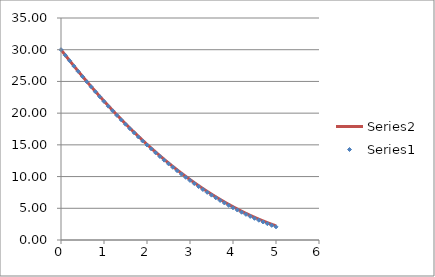
| Category | Series 1 |
|---|---|
| 0.0 | 30 |
| 0.1 | 29.133 |
| 0.2 | 28.279 |
| 0.30000000000000004 | 27.438 |
| 0.4 | 26.61 |
| 0.5 | 25.794 |
| 0.6 | 24.991 |
| 0.7 | 24.2 |
| 0.7999999999999999 | 23.423 |
| 0.8999999999999999 | 22.658 |
| 0.9999999999999999 | 21.906 |
| 1.0999999999999999 | 21.166 |
| 1.2 | 20.439 |
| 1.3 | 19.725 |
| 1.4000000000000001 | 19.023 |
| 1.5000000000000002 | 18.335 |
| 1.6000000000000003 | 17.658 |
| 1.7000000000000004 | 16.995 |
| 1.8000000000000005 | 16.344 |
| 1.9000000000000006 | 15.706 |
| 2.0000000000000004 | 15.081 |
| 2.1000000000000005 | 14.469 |
| 2.2000000000000006 | 13.869 |
| 2.3000000000000007 | 13.281 |
| 2.400000000000001 | 12.707 |
| 2.500000000000001 | 12.145 |
| 2.600000000000001 | 11.596 |
| 2.700000000000001 | 11.06 |
| 2.800000000000001 | 10.536 |
| 2.9000000000000012 | 10.025 |
| 3.0000000000000013 | 9.527 |
| 3.1000000000000014 | 9.041 |
| 3.2000000000000015 | 8.568 |
| 3.3000000000000016 | 8.108 |
| 3.4000000000000017 | 7.661 |
| 3.5000000000000018 | 7.226 |
| 3.600000000000002 | 6.804 |
| 3.700000000000002 | 6.394 |
| 3.800000000000002 | 5.998 |
| 3.900000000000002 | 5.614 |
| 4.000000000000002 | 5.242 |
| 4.100000000000001 | 4.884 |
| 4.200000000000001 | 4.538 |
| 4.300000000000001 | 4.205 |
| 4.4 | 3.884 |
| 4.5 | 3.577 |
| 4.6 | 3.282 |
| 4.699999999999999 | 2.999 |
| 4.799999999999999 | 2.73 |
| 4.899999999999999 | 2.473 |
| 4.999999999999998 | 2.228 |